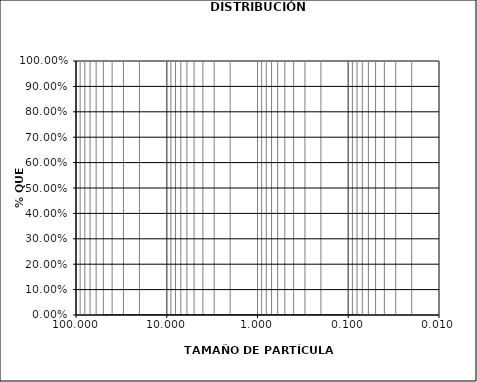
| Category | Series 0 |
|---|---|
| 50.8 | 0 |
| 36.1 | 0 |
| 25.4 | 0 |
| 19.05 | 0 |
| 12.7 | 0 |
| 9.52 | 0 |
| 4.75 | 0 |
| 2.0 | 0 |
| 0.6 | 0 |
| 0.425 | 0 |
| 0.25 | 0 |
| 0.15 | 0 |
| 0.074 | 0 |